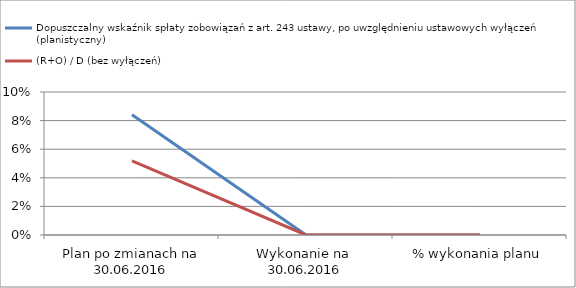
| Category | Dopuszczalny wskaźnik spłaty zobowiązań z art. 243 ustawy, po uwzględnieniu ustawowych wyłączeń (planistyczny)  | (R+O) / D (bez wyłączeń) |
|---|---|---|
| Plan po zmianach na 30.06.2016 | 0.084 | 0.052 |
| Wykonanie na  30.06.2016 | 0 | 0 |
| % wykonania planu | 0 | 0 |